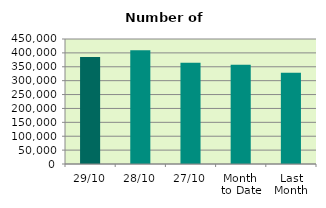
| Category | Series 0 |
|---|---|
| 29/10 | 384948 |
| 28/10 | 409266 |
| 27/10 | 364748 |
| Month 
to Date | 357160.667 |
| Last
Month | 328669.364 |